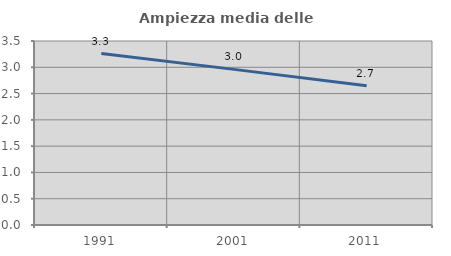
| Category | Ampiezza media delle famiglie |
|---|---|
| 1991.0 | 3.261 |
| 2001.0 | 2.96 |
| 2011.0 | 2.65 |